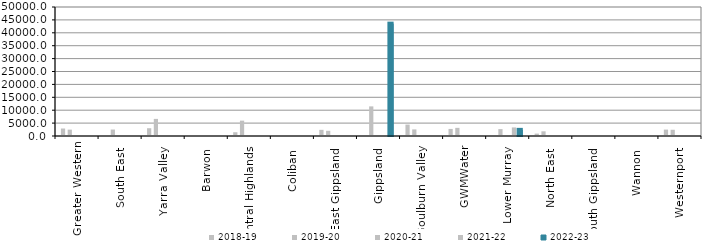
| Category | 2018-19 | 2019-20 | 2020-21 | 2021-22 | 2022-23 |
|---|---|---|---|---|---|
| Greater Western | 2899.296 | 2464.667 | 0 | 0 | 0 |
| South East  | 0 | 2501 | 0 | 0 | 0 |
| Yarra Valley  | 3012.66 | 6628 | 0 | 0 | 0 |
| Barwon  | 0 | 0 | 0 | 0 | 0 |
| Central Highlands  | 1460 | 5949 | 0 | 0 | 0 |
| Coliban  | 0 | 0 | 0 | 0 | 0 |
| East Gippsland  | 2388 | 2016.18 | 0 | 0 | 0 |
| Gippsland  | 0 | 11477.84 | 0 | 0 | 43549 |
| Goulburn Valley  | 4420.53 | 2557.45 | 0 | 0 | 0 |
| GWMWater | 2740 | 3159.116 | 0 | 0 | 0 |
| Lower Murray  | 0 | 2671 | 0 | 3321.63 | 2376.9 |
| North East  | 926.51 | 1813.93 | 0 | 0 | 0 |
| South Gippsland  | 0 | 0 | 0 | 0 | 0 |
| Wannon  | 0 | 0 | 0 | 0 | 0 |
| Westernport  | 2483 | 2414 | 0 | 0 | 0 |